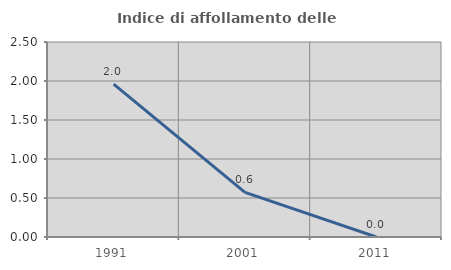
| Category | Indice di affollamento delle abitazioni  |
|---|---|
| 1991.0 | 1.961 |
| 2001.0 | 0.571 |
| 2011.0 | 0 |